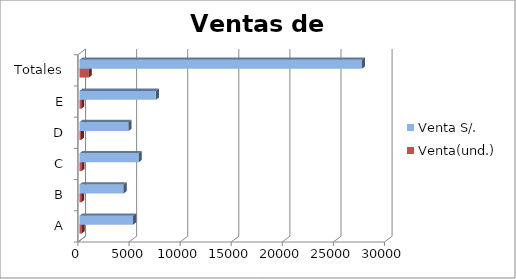
| Category | Venta(und.) | Venta S/. |
|---|---|---|
| A | 210 | 5250 |
| B | 180 | 4320 |
| C | 200 | 5800 |
| D | 150 | 4800 |
| E | 170 | 7480 |
| Totales | 910 | 27650 |